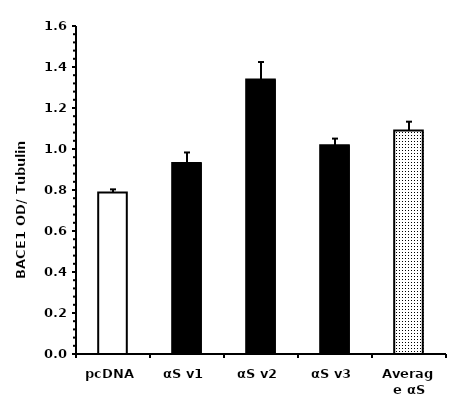
| Category | Series 0 |
|---|---|
| pcDNA | 0.788 |
| αS v1 | 0.931 |
| αS v2 | 1.339 |
| αS v3 | 1.019 |
| Average αS | 1.091 |